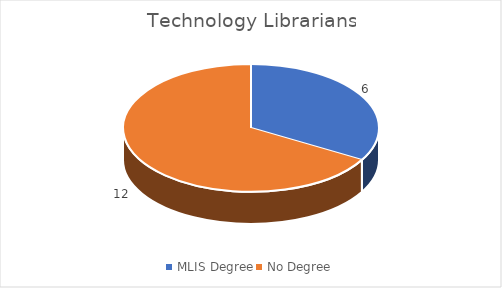
| Category | Series 0 |
|---|---|
| MLIS Degree | 6 |
| No Degree | 12 |